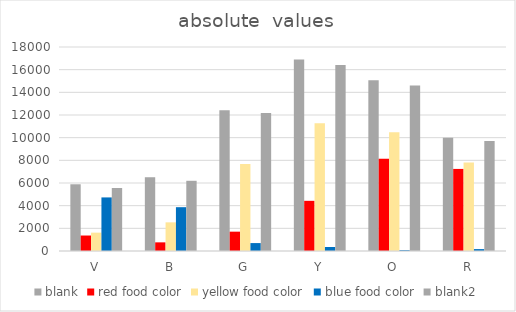
| Category | blank | red food color | yellow food color | blue food color | blank2 |
|---|---|---|---|---|---|
| V | 5888 | 1366 | 1619 | 4728 | 5558 |
| B | 6508 | 763 | 2529 | 3866 | 6195 |
| G | 12426 | 1706 | 7670 | 699 | 12180 |
| Y | 16902 | 4427 | 11265 | 353 | 16422 |
| O | 15058 | 8140 | 10468 | 74 | 14607 |
| R | 9983 | 7242 | 7803 | 168 | 9711 |